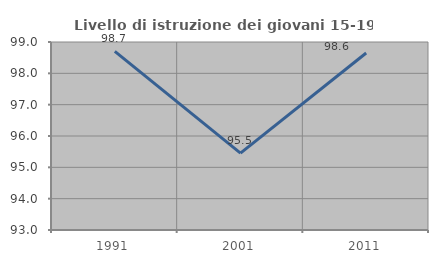
| Category | Livello di istruzione dei giovani 15-19 anni |
|---|---|
| 1991.0 | 98.701 |
| 2001.0 | 95.455 |
| 2011.0 | 98.649 |